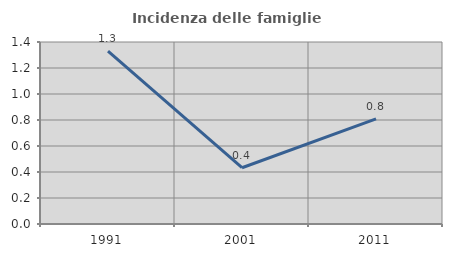
| Category | Incidenza delle famiglie numerose |
|---|---|
| 1991.0 | 1.33 |
| 2001.0 | 0.433 |
| 2011.0 | 0.809 |